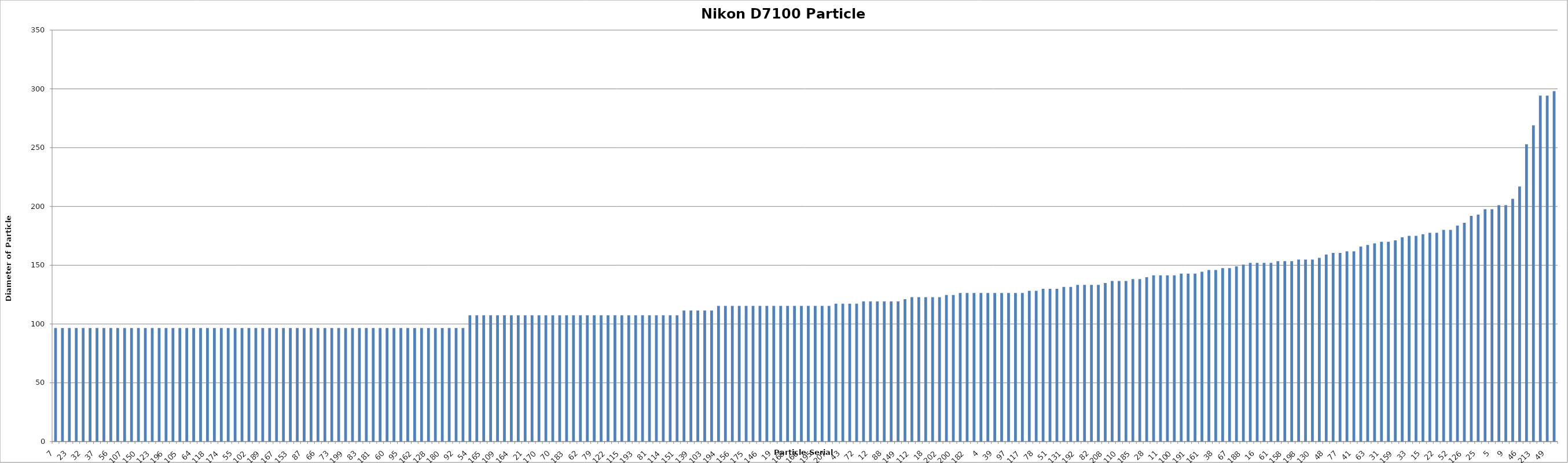
| Category | Diameter if Perfect Circle (um) |
|---|---|
| 7.0 | 96.573 |
| 17.0 | 96.573 |
| 23.0 | 96.573 |
| 29.0 | 96.573 |
| 32.0 | 96.573 |
| 35.0 | 96.573 |
| 37.0 | 96.573 |
| 45.0 | 96.573 |
| 56.0 | 96.573 |
| 144.0 | 96.573 |
| 107.0 | 96.573 |
| 71.0 | 96.573 |
| 150.0 | 96.573 |
| 86.0 | 96.573 |
| 123.0 | 96.573 |
| 201.0 | 96.573 |
| 196.0 | 96.573 |
| 116.0 | 96.573 |
| 105.0 | 96.573 |
| 163.0 | 96.573 |
| 64.0 | 96.573 |
| 147.0 | 96.573 |
| 118.0 | 96.573 |
| 169.0 | 96.573 |
| 174.0 | 96.573 |
| 209.0 | 96.573 |
| 55.0 | 96.573 |
| 212.0 | 96.573 |
| 102.0 | 96.573 |
| 218.0 | 96.573 |
| 189.0 | 96.573 |
| 155.0 | 96.573 |
| 167.0 | 96.573 |
| 140.0 | 96.573 |
| 153.0 | 96.573 |
| 68.0 | 96.573 |
| 87.0 | 96.573 |
| 141.0 | 96.573 |
| 66.0 | 96.573 |
| 89.0 | 96.573 |
| 73.0 | 96.573 |
| 90.0 | 96.573 |
| 199.0 | 96.573 |
| 129.0 | 96.573 |
| 83.0 | 96.573 |
| 187.0 | 96.573 |
| 181.0 | 96.573 |
| 216.0 | 96.573 |
| 60.0 | 96.573 |
| 106.0 | 96.573 |
| 95.0 | 96.573 |
| 148.0 | 96.573 |
| 162.0 | 96.573 |
| 211.0 | 96.573 |
| 128.0 | 96.573 |
| 111.0 | 96.573 |
| 180.0 | 96.573 |
| 154.0 | 96.573 |
| 92.0 | 96.573 |
| 197.0 | 96.573 |
| 54.0 | 107.456 |
| 217.0 | 107.456 |
| 165.0 | 107.456 |
| 119.0 | 107.456 |
| 109.0 | 107.456 |
| 85.0 | 107.456 |
| 164.0 | 107.456 |
| 6.0 | 107.456 |
| 21.0 | 107.456 |
| 24.0 | 107.456 |
| 170.0 | 107.456 |
| 138.0 | 107.456 |
| 70.0 | 107.456 |
| 84.0 | 107.456 |
| 183.0 | 107.456 |
| 152.0 | 107.456 |
| 62.0 | 107.456 |
| 204.0 | 107.456 |
| 79.0 | 107.456 |
| 98.0 | 107.456 |
| 122.0 | 107.456 |
| 94.0 | 107.456 |
| 115.0 | 107.456 |
| 132.0 | 107.456 |
| 193.0 | 107.456 |
| 58.0 | 107.456 |
| 81.0 | 107.456 |
| 160.0 | 107.456 |
| 114.0 | 107.456 |
| 121.0 | 107.456 |
| 151.0 | 107.456 |
| 215.0 | 111.512 |
| 139.0 | 111.512 |
| 176.0 | 111.512 |
| 103.0 | 111.512 |
| 190.0 | 111.512 |
| 194.0 | 115.426 |
| 157.0 | 115.426 |
| 156.0 | 115.426 |
| 145.0 | 115.426 |
| 175.0 | 115.426 |
| 173.0 | 115.426 |
| 146.0 | 115.426 |
| 10.0 | 115.426 |
| 19.0 | 115.426 |
| 44.0 | 115.426 |
| 168.0 | 115.426 |
| 177.0 | 115.426 |
| 166.0 | 115.426 |
| 125.0 | 115.426 |
| 195.0 | 115.426 |
| 135.0 | 115.426 |
| 207.0 | 115.426 |
| 13.0 | 117.334 |
| 43.0 | 117.334 |
| 142.0 | 117.334 |
| 72.0 | 117.334 |
| 3.0 | 119.212 |
| 12.0 | 119.212 |
| 30.0 | 119.212 |
| 88.0 | 119.212 |
| 127.0 | 119.212 |
| 149.0 | 119.212 |
| 179.0 | 121.06 |
| 112.0 | 122.881 |
| 2.0 | 122.881 |
| 18.0 | 122.881 |
| 74.0 | 122.881 |
| 202.0 | 122.881 |
| 203.0 | 124.675 |
| 200.0 | 124.675 |
| 186.0 | 126.443 |
| 182.0 | 126.443 |
| 143.0 | 126.443 |
| 4.0 | 126.443 |
| 8.0 | 126.443 |
| 39.0 | 126.443 |
| 93.0 | 126.443 |
| 97.0 | 126.443 |
| 214.0 | 126.443 |
| 117.0 | 126.443 |
| 178.0 | 128.187 |
| 78.0 | 128.187 |
| 50.0 | 129.908 |
| 51.0 | 129.908 |
| 14.0 | 129.908 |
| 131.0 | 131.606 |
| 133.0 | 131.606 |
| 192.0 | 133.283 |
| 120.0 | 133.283 |
| 82.0 | 133.283 |
| 53.0 | 133.283 |
| 208.0 | 134.939 |
| 101.0 | 136.574 |
| 110.0 | 136.574 |
| 104.0 | 136.574 |
| 185.0 | 138.191 |
| 20.0 | 138.191 |
| 28.0 | 139.788 |
| 59.0 | 141.368 |
| 11.0 | 141.368 |
| 76.0 | 141.368 |
| 100.0 | 141.368 |
| 205.0 | 142.93 |
| 191.0 | 142.93 |
| 69.0 | 142.93 |
| 161.0 | 144.475 |
| 137.0 | 146.004 |
| 38.0 | 146.004 |
| 47.0 | 147.517 |
| 67.0 | 147.517 |
| 134.0 | 149.015 |
| 188.0 | 150.498 |
| 75.0 | 151.966 |
| 16.0 | 151.966 |
| 42.0 | 151.966 |
| 61.0 | 151.966 |
| 108.0 | 153.42 |
| 158.0 | 153.42 |
| 57.0 | 153.42 |
| 198.0 | 154.861 |
| 1.0 | 154.861 |
| 130.0 | 154.861 |
| 65.0 | 156.288 |
| 48.0 | 159.104 |
| 171.0 | 160.494 |
| 77.0 | 160.494 |
| 172.0 | 161.871 |
| 41.0 | 161.871 |
| 184.0 | 165.936 |
| 63.0 | 167.269 |
| 26.0 | 168.591 |
| 31.0 | 169.903 |
| 40.0 | 169.903 |
| 159.0 | 171.205 |
| 113.0 | 173.78 |
| 33.0 | 175.053 |
| 80.0 | 175.053 |
| 15.0 | 176.317 |
| 34.0 | 177.572 |
| 22.0 | 177.572 |
| 27.0 | 180.055 |
| 52.0 | 180.055 |
| 206.0 | 183.718 |
| 126.0 | 186.119 |
| 124.0 | 191.992 |
| 25.0 | 193.145 |
| 136.0 | 197.69 |
| 5.0 | 197.69 |
| 96.0 | 201.032 |
| 9.0 | 201.032 |
| 91.0 | 206.481 |
| 46.0 | 216.969 |
| 36.0 | 252.886 |
| 213.0 | 269.053 |
| 210.0 | 294.281 |
| 49.0 | 294.281 |
| 99.0 | 298.029 |